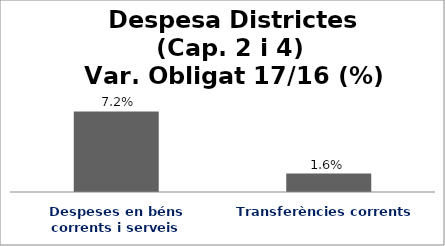
| Category | Series 0 |
|---|---|
| Despeses en béns corrents i serveis | 0.072 |
| Transferències corrents | 0.016 |